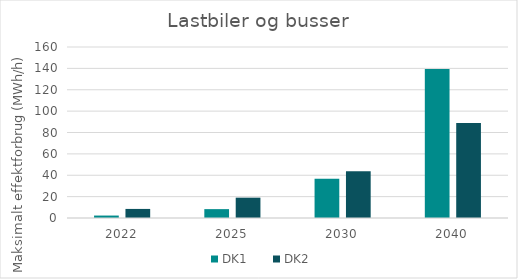
| Category | DK1 | DK2 |
|---|---|---|
| 2022.0 | 2.288 | 8.49 |
| 2025.0 | 8.299 | 19.024 |
| 2030.0 | 36.751 | 43.691 |
| 2040.0 | 139.382 | 88.809 |